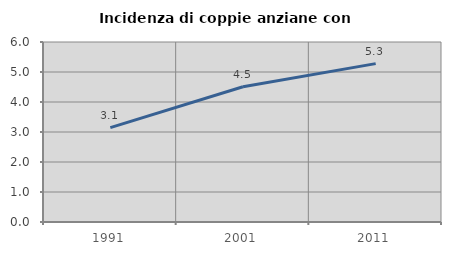
| Category | Incidenza di coppie anziane con figli |
|---|---|
| 1991.0 | 3.146 |
| 2001.0 | 4.507 |
| 2011.0 | 5.279 |